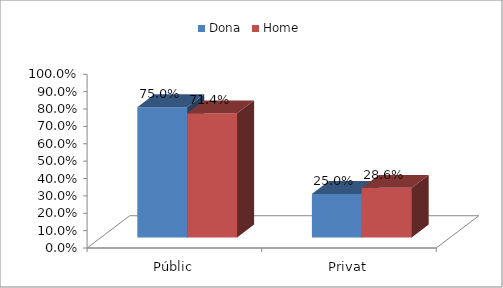
| Category | Dona | Home |
|---|---|---|
| Públic | 0.75 | 0.714 |
| Privat | 0.25 | 0.286 |